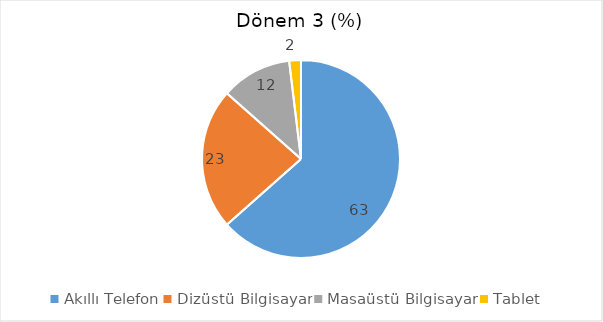
| Category | Dönem 3  (%) |
|---|---|
| Akıllı Telefon | 63.462 |
| Dizüstü Bilgisayar | 23.077 |
| Masaüstü Bilgisayar | 11.538 |
| Tablet | 1.923 |